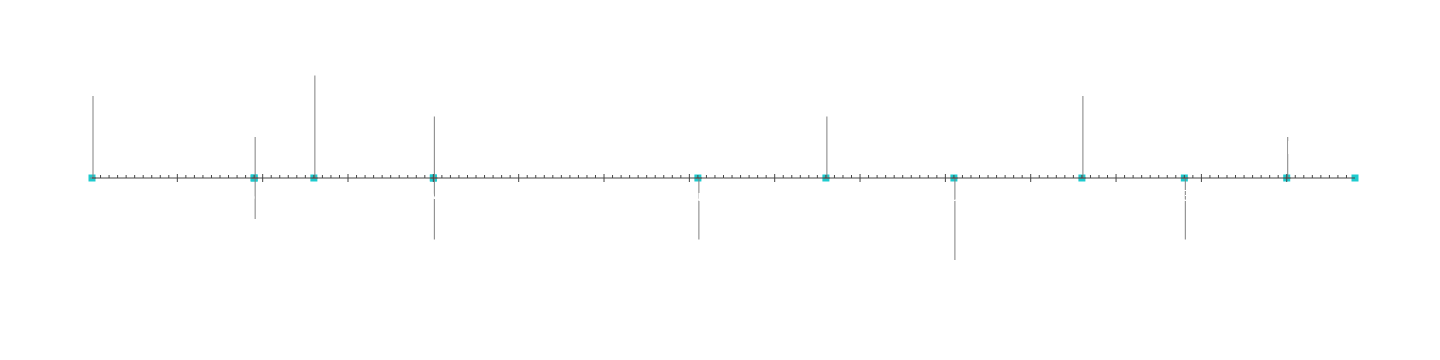
| Category | Позиция |
|---|---|
| Начало проекта | 20 |
| Веха 1 | 10 |
| Веха 2 | -10 |
| Веха 3 | 25 |
| Веха 4 | -15 |
| Веха 5 | 15 |
| Веха 6 | -15 |
| Веха 7 | 15 |
| Веха 8 | -20 |
| Веха 9 | 20 |
| Веха 10 | -15 |
| Веха 11 | 10 |
| Завершение проекта | 5 |